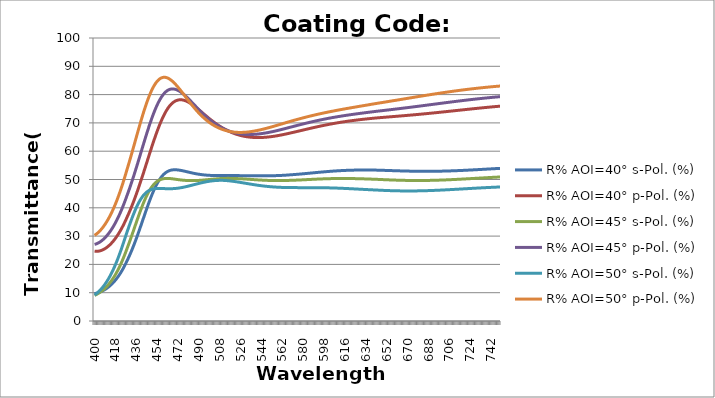
| Category | R% AOI=40° s-Pol. (%) | R% AOI=40° p-Pol. (%) | R% AOI=45° s-Pol. (%) | R% AOI=45° p-Pol. (%) | R% AOI=50° s-Pol. (%) | R% AOI=50° p-Pol. (%) |
|---|---|---|---|---|---|---|
| 400.0 | 9.68 | 24.646 | 9.057 | 27.051 | 9.15 | 30.272 |
| 401.0 | 9.764 | 24.613 | 9.249 | 27.176 | 9.464 | 30.549 |
| 402.0 | 9.866 | 24.615 | 9.462 | 27.335 | 9.803 | 30.864 |
| 403.0 | 9.988 | 24.652 | 9.696 | 27.53 | 10.168 | 31.216 |
| 404.0 | 10.129 | 24.724 | 9.95 | 27.758 | 10.562 | 31.607 |
| 405.0 | 10.289 | 24.828 | 10.227 | 28.022 | 10.986 | 32.035 |
| 406.0 | 10.47 | 24.967 | 10.528 | 28.32 | 11.441 | 32.503 |
| 407.0 | 10.67 | 25.138 | 10.853 | 28.653 | 11.929 | 33.01 |
| 408.0 | 10.892 | 25.342 | 11.204 | 29.021 | 12.451 | 33.557 |
| 409.0 | 11.136 | 25.579 | 11.582 | 29.424 | 13.01 | 34.145 |
| 410.0 | 11.402 | 25.849 | 11.987 | 29.864 | 13.608 | 34.773 |
| 411.0 | 11.691 | 26.151 | 12.423 | 30.339 | 14.244 | 35.444 |
| 412.0 | 12.005 | 26.487 | 12.889 | 30.851 | 14.923 | 36.157 |
| 413.0 | 12.344 | 26.856 | 13.388 | 31.401 | 15.644 | 36.913 |
| 414.0 | 12.709 | 27.259 | 13.921 | 31.988 | 16.41 | 37.713 |
| 415.0 | 13.102 | 27.696 | 14.49 | 32.613 | 17.22 | 38.557 |
| 416.0 | 13.523 | 28.167 | 15.095 | 33.277 | 18.077 | 39.446 |
| 417.0 | 13.974 | 28.674 | 15.739 | 33.98 | 18.98 | 40.38 |
| 418.0 | 14.456 | 29.215 | 16.423 | 34.723 | 19.928 | 41.359 |
| 419.0 | 14.971 | 29.793 | 17.148 | 35.506 | 20.923 | 42.384 |
| 420.0 | 15.519 | 30.406 | 17.915 | 36.329 | 21.962 | 43.455 |
| 421.0 | 16.103 | 31.057 | 18.725 | 37.194 | 23.042 | 44.571 |
| 422.0 | 16.723 | 31.745 | 19.579 | 38.1 | 24.163 | 45.732 |
| 423.0 | 17.38 | 32.471 | 20.478 | 39.046 | 25.319 | 46.937 |
| 424.0 | 18.077 | 33.235 | 21.42 | 40.034 | 26.506 | 48.186 |
| 425.0 | 18.814 | 34.037 | 22.407 | 41.064 | 27.718 | 49.476 |
| 426.0 | 19.592 | 34.878 | 23.436 | 42.133 | 28.95 | 50.806 |
| 427.0 | 20.412 | 35.759 | 24.507 | 43.242 | 30.195 | 52.17 |
| 428.0 | 21.275 | 36.678 | 25.617 | 44.388 | 31.445 | 53.568 |
| 429.0 | 22.13 | 37.578 | 26.701 | 45.507 | 32.621 | 54.925 |
| 430.0 | 23.023 | 38.514 | 27.814 | 46.66 | 33.784 | 56.309 |
| 431.0 | 23.955 | 39.485 | 28.952 | 47.844 | 34.926 | 57.717 |
| 432.0 | 24.923 | 40.489 | 30.111 | 49.059 | 36.041 | 59.144 |
| 433.0 | 25.928 | 41.527 | 31.286 | 50.302 | 37.119 | 60.588 |
| 434.0 | 26.967 | 42.597 | 32.471 | 51.571 | 38.155 | 62.042 |
| 435.0 | 28.039 | 43.698 | 33.661 | 52.864 | 39.141 | 63.503 |
| 436.0 | 29.14 | 44.829 | 34.849 | 54.176 | 40.072 | 64.965 |
| 437.0 | 30.269 | 45.989 | 36.027 | 55.507 | 40.944 | 66.423 |
| 438.0 | 31.42 | 47.174 | 37.19 | 56.85 | 41.752 | 67.869 |
| 439.0 | 32.591 | 48.383 | 38.33 | 58.204 | 42.494 | 69.299 |
| 440.0 | 33.776 | 49.614 | 39.44 | 59.562 | 43.169 | 70.706 |
| 441.0 | 34.971 | 50.864 | 40.512 | 60.922 | 43.777 | 72.083 |
| 442.0 | 36.168 | 52.129 | 41.543 | 62.277 | 44.318 | 73.424 |
| 443.0 | 37.364 | 53.406 | 42.524 | 63.623 | 44.794 | 74.723 |
| 444.0 | 38.55 | 54.693 | 43.453 | 64.956 | 45.208 | 75.972 |
| 445.0 | 39.722 | 55.984 | 44.324 | 66.268 | 45.564 | 77.168 |
| 446.0 | 40.871 | 57.275 | 45.134 | 67.556 | 45.864 | 78.302 |
| 447.0 | 41.993 | 58.562 | 45.88 | 68.814 | 46.114 | 79.372 |
| 448.0 | 43.08 | 59.842 | 46.563 | 70.037 | 46.318 | 80.371 |
| 449.0 | 44.127 | 61.108 | 47.181 | 71.219 | 46.48 | 81.296 |
| 450.0 | 45.129 | 62.357 | 47.735 | 72.355 | 46.606 | 82.144 |
| 451.0 | 46.08 | 63.584 | 48.226 | 73.442 | 46.7 | 82.911 |
| 452.0 | 46.977 | 64.783 | 48.656 | 74.474 | 46.767 | 83.596 |
| 453.0 | 47.816 | 65.951 | 49.028 | 75.447 | 46.811 | 84.198 |
| 454.0 | 48.594 | 67.082 | 49.346 | 76.359 | 46.836 | 84.715 |
| 455.0 | 49.31 | 68.173 | 49.612 | 77.207 | 46.847 | 85.15 |
| 456.0 | 49.964 | 69.22 | 49.83 | 77.987 | 46.846 | 85.501 |
| 457.0 | 50.554 | 70.218 | 50.006 | 78.698 | 46.836 | 85.772 |
| 458.0 | 51.081 | 71.164 | 50.142 | 79.339 | 46.822 | 85.964 |
| 459.0 | 51.547 | 72.055 | 50.244 | 79.909 | 46.804 | 86.08 |
| 460.0 | 51.954 | 72.889 | 50.314 | 80.408 | 46.786 | 86.124 |
| 461.0 | 52.305 | 73.664 | 50.358 | 80.837 | 46.769 | 86.098 |
| 462.0 | 52.602 | 74.378 | 50.379 | 81.196 | 46.756 | 86.008 |
| 463.0 | 52.848 | 75.029 | 50.381 | 81.487 | 46.746 | 85.858 |
| 464.0 | 53.048 | 75.618 | 50.367 | 81.711 | 46.743 | 85.652 |
| 465.0 | 53.204 | 76.143 | 50.339 | 81.872 | 46.746 | 85.394 |
| 466.0 | 53.309 | 76.586 | 50.296 | 81.964 | 46.75 | 85.095 |
| 467.0 | 53.38 | 76.972 | 50.246 | 82.003 | 46.762 | 84.756 |
| 468.0 | 53.423 | 77.301 | 50.192 | 81.989 | 46.782 | 84.381 |
| 469.0 | 53.44 | 77.575 | 50.135 | 81.926 | 46.81 | 83.974 |
| 470.0 | 53.435 | 77.795 | 50.077 | 81.818 | 46.846 | 83.539 |
| 471.0 | 53.41 | 77.963 | 50.019 | 81.666 | 46.889 | 83.08 |
| 472.0 | 53.368 | 78.081 | 49.963 | 81.476 | 46.94 | 82.6 |
| 473.0 | 53.313 | 78.152 | 49.908 | 81.249 | 46.999 | 82.104 |
| 474.0 | 53.245 | 78.178 | 49.857 | 80.989 | 47.064 | 81.593 |
| 475.0 | 53.168 | 78.161 | 49.81 | 80.7 | 47.136 | 81.072 |
| 476.0 | 53.084 | 78.104 | 49.767 | 80.384 | 47.215 | 80.542 |
| 477.0 | 52.994 | 78.01 | 49.729 | 80.045 | 47.298 | 80.008 |
| 478.0 | 52.9 | 77.882 | 49.696 | 79.686 | 47.387 | 79.47 |
| 479.0 | 52.804 | 77.722 | 49.668 | 79.309 | 47.481 | 78.932 |
| 480.0 | 52.707 | 77.533 | 49.645 | 78.916 | 47.578 | 78.396 |
| 481.0 | 52.61 | 77.318 | 49.628 | 78.512 | 47.678 | 77.863 |
| 482.0 | 52.513 | 77.079 | 49.616 | 78.097 | 47.781 | 77.335 |
| 483.0 | 52.419 | 76.819 | 49.609 | 77.675 | 47.885 | 76.813 |
| 484.0 | 52.326 | 76.541 | 49.607 | 77.247 | 47.991 | 76.3 |
| 485.0 | 52.238 | 76.246 | 49.61 | 76.816 | 48.098 | 75.796 |
| 486.0 | 52.152 | 75.937 | 49.616 | 76.382 | 48.204 | 75.302 |
| 487.0 | 52.07 | 75.616 | 49.628 | 75.948 | 48.309 | 74.819 |
| 488.0 | 51.992 | 75.285 | 49.642 | 75.516 | 48.413 | 74.348 |
| 489.0 | 51.919 | 74.946 | 49.661 | 75.087 | 48.514 | 73.89 |
| 490.0 | 51.854 | 74.606 | 49.685 | 74.667 | 48.618 | 73.452 |
| 491.0 | 51.793 | 74.261 | 49.713 | 74.253 | 48.719 | 73.028 |
| 492.0 | 51.737 | 73.914 | 49.744 | 73.846 | 48.817 | 72.618 |
| 493.0 | 51.685 | 73.565 | 49.776 | 73.446 | 48.912 | 72.223 |
| 494.0 | 51.639 | 73.216 | 49.811 | 73.053 | 49.002 | 71.842 |
| 495.0 | 51.597 | 72.868 | 49.848 | 72.67 | 49.088 | 71.476 |
| 496.0 | 51.56 | 72.523 | 49.885 | 72.295 | 49.17 | 71.124 |
| 497.0 | 51.527 | 72.181 | 49.923 | 71.931 | 49.246 | 70.788 |
| 498.0 | 51.498 | 71.843 | 49.962 | 71.577 | 49.317 | 70.466 |
| 499.0 | 51.473 | 71.51 | 50.001 | 71.233 | 49.382 | 70.16 |
| 500.0 | 51.452 | 71.182 | 50.04 | 70.901 | 49.442 | 69.868 |
| 501.0 | 51.434 | 70.861 | 50.078 | 70.58 | 49.496 | 69.591 |
| 502.0 | 51.42 | 70.546 | 50.116 | 70.27 | 49.544 | 69.328 |
| 503.0 | 51.409 | 70.239 | 50.153 | 69.972 | 49.585 | 69.08 |
| 504.0 | 51.4 | 69.94 | 50.188 | 69.686 | 49.621 | 68.846 |
| 505.0 | 51.394 | 69.648 | 50.222 | 69.411 | 49.65 | 68.627 |
| 506.0 | 51.391 | 69.365 | 50.254 | 69.149 | 49.673 | 68.421 |
| 507.0 | 51.389 | 69.091 | 50.284 | 68.898 | 49.69 | 68.228 |
| 508.0 | 51.389 | 68.826 | 50.313 | 68.659 | 49.701 | 68.049 |
| 509.0 | 51.391 | 68.57 | 50.339 | 68.432 | 49.706 | 67.883 |
| 510.0 | 51.395 | 68.323 | 50.363 | 68.216 | 49.706 | 67.729 |
| 511.0 | 51.392 | 68.083 | 50.376 | 68.008 | 49.69 | 67.583 |
| 512.0 | 51.39 | 67.851 | 50.385 | 67.811 | 49.668 | 67.448 |
| 513.0 | 51.388 | 67.629 | 50.392 | 67.624 | 49.641 | 67.325 |
| 514.0 | 51.387 | 67.416 | 50.397 | 67.449 | 49.609 | 67.212 |
| 515.0 | 51.386 | 67.211 | 50.399 | 67.284 | 49.573 | 67.111 |
| 516.0 | 51.385 | 67.016 | 50.398 | 67.129 | 49.532 | 67.02 |
| 517.0 | 51.384 | 66.83 | 50.394 | 66.984 | 49.487 | 66.94 |
| 518.0 | 51.382 | 66.653 | 50.389 | 66.85 | 49.438 | 66.87 |
| 519.0 | 51.381 | 66.484 | 50.38 | 66.725 | 49.386 | 66.809 |
| 520.0 | 51.38 | 66.325 | 50.37 | 66.61 | 49.331 | 66.758 |
| 521.0 | 51.378 | 66.175 | 50.357 | 66.505 | 49.273 | 66.716 |
| 522.0 | 51.376 | 66.033 | 50.342 | 66.409 | 49.213 | 66.683 |
| 523.0 | 51.374 | 65.9 | 50.325 | 66.322 | 49.15 | 66.659 |
| 524.0 | 51.371 | 65.775 | 50.307 | 66.244 | 49.086 | 66.643 |
| 525.0 | 51.368 | 65.659 | 50.286 | 66.175 | 49.02 | 66.635 |
| 526.0 | 51.365 | 65.55 | 50.264 | 66.114 | 48.952 | 66.634 |
| 527.0 | 51.361 | 65.45 | 50.241 | 66.061 | 48.884 | 66.642 |
| 528.0 | 51.357 | 65.358 | 50.216 | 66.016 | 48.814 | 66.656 |
| 529.0 | 51.352 | 65.274 | 50.191 | 65.98 | 48.745 | 66.677 |
| 530.0 | 51.348 | 65.198 | 50.164 | 65.95 | 48.675 | 66.705 |
| 531.0 | 51.343 | 65.129 | 50.137 | 65.928 | 48.605 | 66.74 |
| 532.0 | 51.338 | 65.067 | 50.11 | 65.914 | 48.536 | 66.78 |
| 533.0 | 51.333 | 65.013 | 50.082 | 65.906 | 48.467 | 66.827 |
| 534.0 | 51.328 | 64.965 | 50.053 | 65.905 | 48.398 | 66.879 |
| 535.0 | 51.324 | 64.925 | 50.025 | 65.91 | 48.331 | 66.937 |
| 536.0 | 51.319 | 64.891 | 49.997 | 65.922 | 48.265 | 67 |
| 537.0 | 51.314 | 64.864 | 49.969 | 65.94 | 48.2 | 67.067 |
| 538.0 | 51.31 | 64.843 | 49.941 | 65.963 | 48.136 | 67.139 |
| 539.0 | 51.306 | 64.829 | 49.914 | 65.992 | 48.074 | 67.216 |
| 540.0 | 51.303 | 64.82 | 49.887 | 66.027 | 48.013 | 67.297 |
| 541.0 | 51.3 | 64.818 | 49.862 | 66.067 | 47.954 | 67.381 |
| 542.0 | 51.298 | 64.821 | 49.837 | 66.111 | 47.898 | 67.47 |
| 543.0 | 51.296 | 64.829 | 49.813 | 66.161 | 47.843 | 67.562 |
| 544.0 | 51.295 | 64.844 | 49.79 | 66.215 | 47.79 | 67.657 |
| 545.0 | 51.295 | 64.863 | 49.768 | 66.273 | 47.739 | 67.755 |
| 546.0 | 51.296 | 64.887 | 49.748 | 66.336 | 47.69 | 67.856 |
| 547.0 | 51.298 | 64.916 | 49.728 | 66.402 | 47.643 | 67.96 |
| 548.0 | 51.3 | 64.949 | 49.71 | 66.473 | 47.599 | 68.066 |
| 549.0 | 51.304 | 64.988 | 49.694 | 66.546 | 47.557 | 68.174 |
| 550.0 | 51.309 | 65.03 | 49.679 | 66.624 | 47.516 | 68.285 |
| 551.0 | 51.315 | 65.076 | 49.665 | 66.704 | 47.479 | 68.397 |
| 552.0 | 51.322 | 65.127 | 49.653 | 66.787 | 47.443 | 68.511 |
| 553.0 | 51.33 | 65.181 | 49.643 | 66.873 | 47.41 | 68.626 |
| 554.0 | 51.34 | 65.24 | 49.634 | 66.962 | 47.378 | 68.743 |
| 555.0 | 51.35 | 65.301 | 49.627 | 67.053 | 47.349 | 68.861 |
| 556.0 | 51.363 | 65.366 | 49.621 | 67.146 | 47.322 | 68.98 |
| 557.0 | 51.376 | 65.434 | 49.618 | 67.242 | 47.297 | 69.1 |
| 558.0 | 51.391 | 65.505 | 49.615 | 67.339 | 47.274 | 69.221 |
| 559.0 | 51.407 | 65.578 | 49.615 | 67.439 | 47.254 | 69.342 |
| 560.0 | 51.425 | 65.655 | 49.616 | 67.539 | 47.234 | 69.464 |
| 561.0 | 51.444 | 65.734 | 49.618 | 67.642 | 47.217 | 69.586 |
| 562.0 | 51.464 | 65.815 | 49.622 | 67.745 | 47.202 | 69.708 |
| 563.0 | 51.486 | 65.899 | 49.628 | 67.85 | 47.188 | 69.831 |
| 564.0 | 51.509 | 65.984 | 49.635 | 67.956 | 47.175 | 69.953 |
| 565.0 | 51.537 | 66.074 | 49.648 | 68.064 | 47.169 | 70.076 |
| 566.0 | 51.567 | 66.165 | 49.662 | 68.173 | 47.164 | 70.199 |
| 567.0 | 51.598 | 66.258 | 49.677 | 68.282 | 47.16 | 70.322 |
| 568.0 | 51.63 | 66.353 | 49.694 | 68.392 | 47.157 | 70.444 |
| 569.0 | 51.658 | 66.444 | 49.706 | 68.498 | 47.151 | 70.562 |
| 570.0 | 51.687 | 66.536 | 49.719 | 68.604 | 47.145 | 70.678 |
| 571.0 | 51.717 | 66.629 | 49.733 | 68.709 | 47.14 | 70.794 |
| 572.0 | 51.748 | 66.723 | 49.748 | 68.815 | 47.136 | 70.91 |
| 573.0 | 51.78 | 66.817 | 49.765 | 68.921 | 47.133 | 71.024 |
| 574.0 | 51.813 | 66.913 | 49.781 | 69.026 | 47.13 | 71.138 |
| 575.0 | 51.846 | 67.009 | 49.799 | 69.132 | 47.128 | 71.251 |
| 576.0 | 51.881 | 67.105 | 49.817 | 69.237 | 47.127 | 71.363 |
| 577.0 | 51.916 | 67.202 | 49.836 | 69.341 | 47.126 | 71.474 |
| 578.0 | 51.952 | 67.299 | 49.855 | 69.445 | 47.125 | 71.583 |
| 579.0 | 51.988 | 67.396 | 49.875 | 69.548 | 47.124 | 71.692 |
| 580.0 | 52.026 | 67.493 | 49.895 | 69.65 | 47.124 | 71.8 |
| 581.0 | 52.063 | 67.59 | 49.915 | 69.752 | 47.124 | 71.906 |
| 582.0 | 52.101 | 67.686 | 49.936 | 69.853 | 47.124 | 72.012 |
| 583.0 | 52.14 | 67.783 | 49.957 | 69.953 | 47.124 | 72.116 |
| 584.0 | 52.178 | 67.879 | 49.978 | 70.052 | 47.124 | 72.22 |
| 585.0 | 52.217 | 67.975 | 49.998 | 70.15 | 47.123 | 72.321 |
| 586.0 | 52.256 | 68.07 | 50.019 | 70.247 | 47.122 | 72.422 |
| 587.0 | 52.295 | 68.164 | 50.039 | 70.343 | 47.122 | 72.522 |
| 588.0 | 52.334 | 68.258 | 50.06 | 70.438 | 47.12 | 72.62 |
| 589.0 | 52.373 | 68.352 | 50.08 | 70.532 | 47.119 | 72.718 |
| 590.0 | 52.412 | 68.444 | 50.1 | 70.625 | 47.117 | 72.814 |
| 591.0 | 52.451 | 68.536 | 50.119 | 70.716 | 47.114 | 72.909 |
| 592.0 | 52.489 | 68.626 | 50.138 | 70.807 | 47.111 | 73.003 |
| 593.0 | 52.528 | 68.716 | 50.156 | 70.896 | 47.108 | 73.095 |
| 594.0 | 52.566 | 68.805 | 50.174 | 70.984 | 47.103 | 73.187 |
| 595.0 | 52.603 | 68.892 | 50.191 | 71.07 | 47.099 | 73.277 |
| 596.0 | 52.64 | 68.979 | 50.208 | 71.156 | 47.093 | 73.367 |
| 597.0 | 52.676 | 69.065 | 50.224 | 71.24 | 47.087 | 73.455 |
| 598.0 | 52.712 | 69.149 | 50.239 | 71.322 | 47.08 | 73.542 |
| 599.0 | 52.748 | 69.232 | 50.253 | 71.404 | 47.073 | 73.628 |
| 600.0 | 52.782 | 69.314 | 50.267 | 71.484 | 47.065 | 73.714 |
| 601.0 | 52.816 | 69.395 | 50.279 | 71.564 | 47.056 | 73.798 |
| 602.0 | 52.849 | 69.474 | 50.291 | 71.641 | 47.046 | 73.881 |
| 603.0 | 52.881 | 69.552 | 50.302 | 71.718 | 47.036 | 73.964 |
| 604.0 | 52.912 | 69.629 | 50.312 | 71.794 | 47.025 | 74.045 |
| 605.0 | 52.942 | 69.705 | 50.321 | 71.868 | 47.013 | 74.126 |
| 606.0 | 52.972 | 69.779 | 50.329 | 71.941 | 47.001 | 74.206 |
| 607.0 | 53 | 69.852 | 50.337 | 72.013 | 46.987 | 74.285 |
| 608.0 | 53.028 | 69.924 | 50.343 | 72.084 | 46.974 | 74.364 |
| 609.0 | 53.054 | 69.994 | 50.348 | 72.154 | 46.959 | 74.441 |
| 610.0 | 53.079 | 70.064 | 50.352 | 72.222 | 46.944 | 74.518 |
| 611.0 | 53.103 | 70.132 | 50.356 | 72.29 | 46.928 | 74.595 |
| 612.0 | 53.126 | 70.198 | 50.358 | 72.356 | 46.912 | 74.67 |
| 613.0 | 53.148 | 70.263 | 50.36 | 72.422 | 46.894 | 74.746 |
| 614.0 | 53.169 | 70.327 | 50.36 | 72.487 | 46.877 | 74.82 |
| 615.0 | 53.189 | 70.39 | 50.359 | 72.55 | 46.859 | 74.894 |
| 616.0 | 53.208 | 70.452 | 50.358 | 72.613 | 46.84 | 74.968 |
| 617.0 | 53.225 | 70.512 | 50.356 | 72.675 | 46.821 | 75.041 |
| 618.0 | 53.241 | 70.571 | 50.352 | 72.736 | 46.801 | 75.114 |
| 619.0 | 53.256 | 70.629 | 50.348 | 72.797 | 46.782 | 75.186 |
| 620.0 | 53.27 | 70.686 | 50.343 | 72.856 | 46.761 | 75.258 |
| 621.0 | 53.283 | 70.742 | 50.337 | 72.915 | 46.74 | 75.33 |
| 622.0 | 53.294 | 70.796 | 50.33 | 72.973 | 46.719 | 75.401 |
| 623.0 | 53.305 | 70.85 | 50.323 | 73.031 | 46.698 | 75.472 |
| 624.0 | 53.314 | 70.902 | 50.315 | 73.088 | 46.677 | 75.543 |
| 625.0 | 53.322 | 70.954 | 50.306 | 73.144 | 46.655 | 75.613 |
| 626.0 | 53.33 | 71.004 | 50.296 | 73.2 | 46.633 | 75.684 |
| 627.0 | 53.336 | 71.054 | 50.286 | 73.255 | 46.612 | 75.754 |
| 628.0 | 53.341 | 71.103 | 50.276 | 73.31 | 46.59 | 75.824 |
| 629.0 | 53.345 | 71.151 | 50.264 | 73.364 | 46.568 | 75.894 |
| 630.0 | 53.348 | 71.198 | 50.252 | 73.418 | 46.546 | 75.963 |
| 631.0 | 53.35 | 71.244 | 50.24 | 73.471 | 46.524 | 76.033 |
| 632.0 | 53.352 | 71.29 | 50.227 | 73.524 | 46.502 | 76.103 |
| 633.0 | 53.352 | 71.334 | 50.214 | 73.577 | 46.481 | 76.172 |
| 634.0 | 53.351 | 71.378 | 50.2 | 73.629 | 46.459 | 76.242 |
| 635.0 | 53.35 | 71.422 | 50.186 | 73.681 | 46.438 | 76.311 |
| 636.0 | 53.348 | 71.464 | 50.172 | 73.733 | 46.417 | 76.381 |
| 637.0 | 53.345 | 71.506 | 50.157 | 73.785 | 46.397 | 76.45 |
| 638.0 | 53.341 | 71.548 | 50.143 | 73.836 | 46.376 | 76.52 |
| 639.0 | 53.337 | 71.589 | 50.128 | 73.888 | 46.356 | 76.589 |
| 640.0 | 53.332 | 71.63 | 50.113 | 73.939 | 46.337 | 76.659 |
| 641.0 | 53.327 | 71.67 | 50.098 | 73.99 | 46.318 | 76.728 |
| 642.0 | 53.32 | 71.71 | 50.082 | 74.041 | 46.299 | 76.798 |
| 643.0 | 53.314 | 71.749 | 50.067 | 74.092 | 46.281 | 76.868 |
| 644.0 | 53.302 | 71.784 | 50.048 | 74.139 | 46.259 | 76.934 |
| 645.0 | 53.29 | 71.818 | 50.029 | 74.186 | 46.238 | 77 |
| 646.0 | 53.278 | 71.853 | 50.01 | 74.233 | 46.218 | 77.066 |
| 647.0 | 53.265 | 71.887 | 49.991 | 74.28 | 46.198 | 77.133 |
| 648.0 | 53.253 | 71.921 | 49.972 | 74.328 | 46.179 | 77.199 |
| 649.0 | 53.239 | 71.955 | 49.954 | 74.375 | 46.16 | 77.266 |
| 650.0 | 53.226 | 71.989 | 49.936 | 74.422 | 46.143 | 77.332 |
| 651.0 | 53.213 | 72.022 | 49.918 | 74.47 | 46.126 | 77.399 |
| 652.0 | 53.199 | 72.056 | 49.9 | 74.518 | 46.109 | 77.466 |
| 653.0 | 53.185 | 72.089 | 49.883 | 74.565 | 46.094 | 77.533 |
| 654.0 | 53.172 | 72.122 | 49.867 | 74.613 | 46.079 | 77.6 |
| 655.0 | 53.158 | 72.156 | 49.85 | 74.661 | 46.065 | 77.668 |
| 656.0 | 53.144 | 72.189 | 49.834 | 74.709 | 46.052 | 77.735 |
| 657.0 | 53.13 | 72.222 | 49.819 | 74.758 | 46.04 | 77.802 |
| 658.0 | 53.117 | 72.256 | 49.804 | 74.806 | 46.028 | 77.87 |
| 659.0 | 53.103 | 72.289 | 49.79 | 74.855 | 46.017 | 77.938 |
| 660.0 | 53.09 | 72.323 | 49.776 | 74.904 | 46.007 | 78.005 |
| 661.0 | 53.077 | 72.356 | 49.763 | 74.953 | 45.998 | 78.073 |
| 662.0 | 53.064 | 72.39 | 49.751 | 75.002 | 45.99 | 78.141 |
| 663.0 | 53.051 | 72.424 | 49.739 | 75.052 | 45.983 | 78.209 |
| 664.0 | 53.039 | 72.458 | 49.728 | 75.102 | 45.976 | 78.276 |
| 665.0 | 53.027 | 72.492 | 49.717 | 75.152 | 45.971 | 78.344 |
| 666.0 | 53.015 | 72.527 | 49.707 | 75.202 | 45.966 | 78.412 |
| 667.0 | 53.004 | 72.561 | 49.698 | 75.252 | 45.962 | 78.48 |
| 668.0 | 52.993 | 72.596 | 49.689 | 75.303 | 45.96 | 78.548 |
| 669.0 | 52.983 | 72.631 | 49.682 | 75.353 | 45.958 | 78.616 |
| 670.0 | 52.973 | 72.666 | 49.674 | 75.404 | 45.956 | 78.684 |
| 671.0 | 52.963 | 72.702 | 49.668 | 75.455 | 45.956 | 78.752 |
| 672.0 | 52.954 | 72.738 | 49.662 | 75.507 | 45.956 | 78.82 |
| 673.0 | 52.946 | 72.774 | 49.658 | 75.558 | 45.958 | 78.887 |
| 674.0 | 52.938 | 72.81 | 49.654 | 75.61 | 45.96 | 78.955 |
| 675.0 | 52.93 | 72.846 | 49.65 | 75.662 | 45.963 | 79.023 |
| 676.0 | 52.923 | 72.883 | 49.648 | 75.714 | 45.967 | 79.09 |
| 677.0 | 52.917 | 72.92 | 49.646 | 75.766 | 45.972 | 79.158 |
| 678.0 | 52.911 | 72.957 | 49.645 | 75.819 | 45.977 | 79.225 |
| 679.0 | 52.906 | 72.995 | 49.644 | 75.871 | 45.984 | 79.292 |
| 680.0 | 52.902 | 73.033 | 49.645 | 75.924 | 45.991 | 79.359 |
| 681.0 | 52.898 | 73.071 | 49.646 | 75.976 | 45.998 | 79.426 |
| 682.0 | 52.894 | 73.109 | 49.648 | 76.03 | 46.007 | 79.492 |
| 683.0 | 52.892 | 73.148 | 49.651 | 76.082 | 46.016 | 79.558 |
| 684.0 | 52.89 | 73.187 | 49.655 | 76.136 | 46.027 | 79.625 |
| 685.0 | 52.89 | 73.227 | 49.66 | 76.189 | 46.039 | 79.691 |
| 686.0 | 52.89 | 73.267 | 49.666 | 76.243 | 46.051 | 79.757 |
| 687.0 | 52.891 | 73.307 | 49.672 | 76.297 | 46.064 | 79.822 |
| 688.0 | 52.892 | 73.347 | 49.679 | 76.35 | 46.077 | 79.888 |
| 689.0 | 52.894 | 73.388 | 49.687 | 76.404 | 46.091 | 79.953 |
| 690.0 | 52.897 | 73.429 | 49.696 | 76.458 | 46.106 | 80.018 |
| 691.0 | 52.9 | 73.47 | 49.705 | 76.512 | 46.121 | 80.082 |
| 692.0 | 52.904 | 73.511 | 49.715 | 76.565 | 46.137 | 80.146 |
| 693.0 | 52.909 | 73.553 | 49.726 | 76.619 | 46.153 | 80.21 |
| 694.0 | 52.914 | 73.594 | 49.737 | 76.673 | 46.17 | 80.274 |
| 695.0 | 52.92 | 73.636 | 49.749 | 76.727 | 46.188 | 80.337 |
| 696.0 | 52.927 | 73.678 | 49.762 | 76.78 | 46.206 | 80.4 |
| 697.0 | 52.934 | 73.721 | 49.775 | 76.834 | 46.224 | 80.462 |
| 698.0 | 52.942 | 73.763 | 49.788 | 76.887 | 46.244 | 80.524 |
| 699.0 | 52.951 | 73.806 | 49.803 | 76.941 | 46.263 | 80.586 |
| 700.0 | 52.96 | 73.849 | 49.818 | 76.994 | 46.283 | 80.647 |
| 701.0 | 52.97 | 73.892 | 49.834 | 77.047 | 46.303 | 80.707 |
| 702.0 | 52.981 | 73.935 | 49.85 | 77.1 | 46.324 | 80.768 |
| 703.0 | 52.992 | 73.978 | 49.866 | 77.153 | 46.345 | 80.827 |
| 704.0 | 53.004 | 74.022 | 49.883 | 77.206 | 46.366 | 80.887 |
| 705.0 | 53.016 | 74.065 | 49.901 | 77.259 | 46.388 | 80.946 |
| 706.0 | 53.03 | 74.108 | 49.919 | 77.311 | 46.41 | 81.004 |
| 707.0 | 53.043 | 74.152 | 49.938 | 77.363 | 46.432 | 81.062 |
| 708.0 | 53.057 | 74.196 | 49.957 | 77.415 | 46.454 | 81.12 |
| 709.0 | 53.072 | 74.24 | 49.976 | 77.467 | 46.477 | 81.176 |
| 710.0 | 53.087 | 74.283 | 49.996 | 77.519 | 46.499 | 81.233 |
| 711.0 | 53.103 | 74.327 | 50.016 | 77.57 | 46.522 | 81.289 |
| 712.0 | 53.119 | 74.371 | 50.037 | 77.621 | 46.546 | 81.344 |
| 713.0 | 53.136 | 74.415 | 50.058 | 77.672 | 46.569 | 81.399 |
| 714.0 | 53.153 | 74.458 | 50.079 | 77.722 | 46.592 | 81.453 |
| 715.0 | 53.17 | 74.502 | 50.1 | 77.772 | 46.616 | 81.507 |
| 716.0 | 53.188 | 74.546 | 50.122 | 77.822 | 46.639 | 81.56 |
| 717.0 | 53.207 | 74.59 | 50.144 | 77.872 | 46.663 | 81.613 |
| 718.0 | 53.226 | 74.633 | 50.167 | 77.921 | 46.687 | 81.665 |
| 719.0 | 53.245 | 74.677 | 50.189 | 77.97 | 46.71 | 81.717 |
| 720.0 | 53.265 | 74.72 | 50.212 | 78.018 | 46.734 | 81.768 |
| 721.0 | 53.285 | 74.764 | 50.235 | 78.067 | 46.758 | 81.818 |
| 722.0 | 53.305 | 74.807 | 50.258 | 78.114 | 46.781 | 81.868 |
| 723.0 | 53.326 | 74.85 | 50.281 | 78.162 | 46.805 | 81.917 |
| 724.0 | 53.347 | 74.893 | 50.304 | 78.209 | 46.828 | 81.966 |
| 725.0 | 53.368 | 74.936 | 50.328 | 78.256 | 46.852 | 82.014 |
| 726.0 | 53.39 | 74.978 | 50.352 | 78.302 | 46.875 | 82.062 |
| 727.0 | 53.412 | 75.021 | 50.375 | 78.348 | 46.898 | 82.109 |
| 728.0 | 53.434 | 75.063 | 50.399 | 78.393 | 46.921 | 82.156 |
| 729.0 | 53.456 | 75.105 | 50.422 | 78.438 | 46.944 | 82.202 |
| 730.0 | 53.478 | 75.147 | 50.446 | 78.483 | 46.966 | 82.247 |
| 731.0 | 53.501 | 75.188 | 50.47 | 78.527 | 46.989 | 82.292 |
| 732.0 | 53.524 | 75.23 | 50.494 | 78.571 | 47.011 | 82.336 |
| 733.0 | 53.547 | 75.271 | 50.517 | 78.614 | 47.033 | 82.38 |
| 734.0 | 53.57 | 75.312 | 50.541 | 78.657 | 47.055 | 82.423 |
| 735.0 | 53.593 | 75.352 | 50.564 | 78.7 | 47.076 | 82.465 |
| 736.0 | 53.616 | 75.393 | 50.588 | 78.742 | 47.098 | 82.507 |
| 737.0 | 53.64 | 75.433 | 50.611 | 78.783 | 47.119 | 82.549 |
| 738.0 | 53.663 | 75.473 | 50.634 | 78.824 | 47.14 | 82.59 |
| 739.0 | 53.686 | 75.512 | 50.657 | 78.865 | 47.16 | 82.63 |
| 740.0 | 53.71 | 75.551 | 50.68 | 78.905 | 47.18 | 82.67 |
| 741.0 | 53.733 | 75.59 | 50.703 | 78.945 | 47.2 | 82.71 |
| 742.0 | 53.757 | 75.629 | 50.726 | 78.984 | 47.22 | 82.748 |
| 743.0 | 53.78 | 75.667 | 50.748 | 79.023 | 47.239 | 82.787 |
| 744.0 | 53.804 | 75.705 | 50.77 | 79.061 | 47.258 | 82.825 |
| 745.0 | 53.827 | 75.742 | 50.793 | 79.099 | 47.277 | 82.862 |
| 746.0 | 53.851 | 75.78 | 50.814 | 79.136 | 47.296 | 82.899 |
| 747.0 | 53.871 | 75.814 | 50.833 | 79.171 | 47.311 | 82.933 |
| 748.0 | 53.891 | 75.848 | 50.852 | 79.205 | 47.326 | 82.967 |
| 749.0 | 53.912 | 75.882 | 50.87 | 79.239 | 47.341 | 83.001 |
| 750.0 | 53.932 | 75.915 | 50.889 | 79.272 | 47.356 | 83.034 |